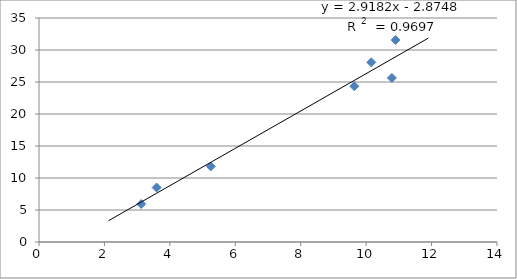
| Category | Series 0 |
|---|---|
| 5.2495621438485705 | 11.809 |
| 3.594814455127283 | 8.508 |
| 10.786848760361336 | 25.642 |
| 3.124316089288144 | 5.934 |
| 10.15873346852889 | 28.07 |
| 9.638251275990886 | 24.337 |
| 10.90046789300729 | 31.564 |